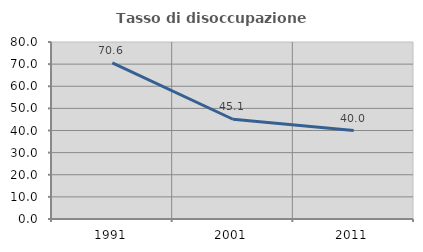
| Category | Tasso di disoccupazione giovanile  |
|---|---|
| 1991.0 | 70.588 |
| 2001.0 | 45.087 |
| 2011.0 | 40 |